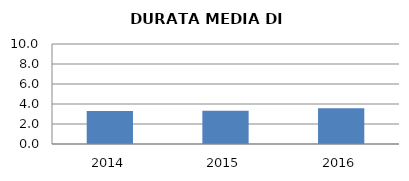
| Category | 2014 2015 2016 |
|---|---|
| 2014.0 | 3.312 |
| 2015.0 | 3.333 |
| 2016.0 | 3.579 |